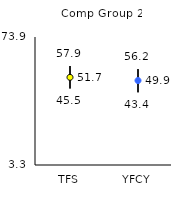
| Category | 25th | 75th | Mean |
|---|---|---|---|
| TFS | 45.5 | 57.9 | 51.65 |
| YFCY | 43.4 | 56.2 | 49.89 |